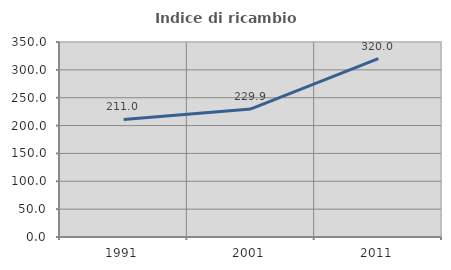
| Category | Indice di ricambio occupazionale  |
|---|---|
| 1991.0 | 210.989 |
| 2001.0 | 229.87 |
| 2011.0 | 320 |